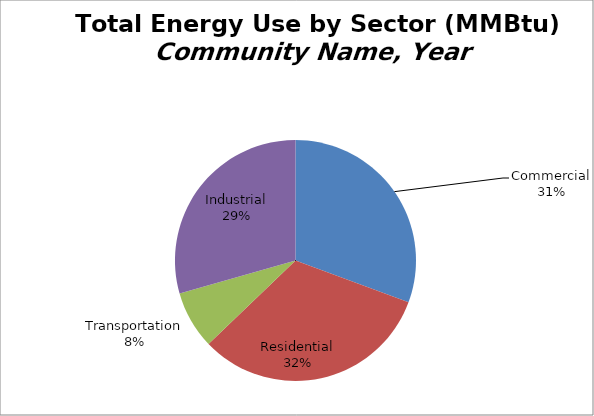
| Category | Series 0 |
|---|---|
| Commercial | 30.642 |
| Residential | 32.194 |
| Transportation | 7.764 |
| Industrial | 29.4 |